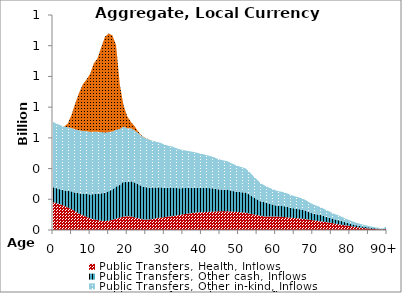
| Category | Public Transfers, Health, Inflows | Public Transfers, Other cash, Inflows | Public Transfers, Other in-kind, Inflows | Public Transfers, Education, Inflows |
|---|---|---|---|---|
| 0 | 181.392 | 97.981 | 424.615 | 0 |
|  | 174.145 | 97.458 | 420.827 | 0 |
| 2 | 167.344 | 97.129 | 417.9 | 0 |
| 3 | 158.039 | 100.06 | 415.681 | 0 |
| 4 | 146.757 | 107.985 | 414.015 | 24.991 |
| 5 | 136.594 | 115.028 | 412.747 | 86.294 |
| 6 | 120.806 | 122.581 | 411.723 | 170.289 |
| 7 | 107.274 | 131.753 | 410.788 | 242.456 |
| 8 | 96.344 | 138.584 | 409.787 | 303.097 |
| 9 | 86.519 | 149.341 | 408.567 | 335.093 |
| 10 | 76.235 | 154.927 | 407.285 | 378.06 |
| 11 | 69.835 | 163.818 | 406.102 | 444.971 |
| 12 | 64.805 | 171.273 | 403.294 | 477.943 |
| 13 | 60.067 | 178.689 | 398.081 | 553.456 |
| 14 | 58.728 | 184.061 | 391.249 | 624.63 |
| 15 | 60.785 | 192.512 | 384.344 | 641.855 |
| 16 | 66.425 | 197.652 | 377.031 | 626.849 |
| 17 | 73.264 | 209.281 | 370.054 | 551.113 |
| 18 | 80.301 | 213.286 | 363.929 | 289.528 |
| 19 | 88.064 | 227.235 | 358.278 | 139.84 |
| 20 | 89.388 | 221.265 | 352.228 | 77.954 |
| 21 | 88.582 | 228.749 | 345.98 | 40.091 |
| 22 | 82.518 | 226.507 | 339.471 | 27.086 |
| 23 | 76.21 | 221.739 | 332.59 | 9.22 |
| 24 | 70.201 | 213.411 | 325.45 | 3.098 |
| 25 | 67.569 | 211.699 | 318.326 | 1.483 |
| 26 | 68.55 | 206.788 | 311.221 | 1.103 |
| 27 | 72.314 | 204.07 | 303.988 | 0 |
| 28 | 77.538 | 199.615 | 296.599 | 0 |
| 29 | 81.316 | 196.775 | 289.155 | 0 |
| 30 | 83.654 | 191.311 | 281.769 | 0 |
| 31 | 87.14 | 187.899 | 274.403 | 0 |
| 32 | 90.428 | 186.685 | 267.401 | 0 |
| 33 | 93.36 | 180.823 | 260.939 | 0 |
| 34 | 97.533 | 173.812 | 254.876 | 0 |
| 35 | 102.347 | 170.554 | 248.866 | 0 |
| 36 | 105.52 | 167.621 | 242.947 | 0 |
| 37 | 108.761 | 166.14 | 237.227 | 0 |
| 38 | 112.403 | 163.538 | 231.717 | 0 |
| 39 | 114.824 | 160.843 | 226.366 | 0 |
| 40 | 115.73 | 158.997 | 221.078 | 0 |
| 41 | 116.856 | 157.668 | 215.828 | 0 |
| 42 | 118.083 | 154.681 | 210.657 | 0 |
| 43 | 119.154 | 152.975 | 205.561 | 0 |
| 44 | 121.104 | 145.485 | 200.482 | 0 |
| 45 | 122.558 | 141.258 | 195.302 | 0 |
| 46 | 122.999 | 139.806 | 189.972 | 0 |
| 47 | 121.93 | 141.494 | 184.584 | 0 |
| 48 | 119.929 | 136.256 | 179.148 | 0 |
| 49 | 118.789 | 132.629 | 173.556 | 0 |
| 50 | 116.738 | 130.799 | 167.956 | 0 |
| 51 | 114.514 | 131.086 | 162.638 | 0 |
| 52 | 111.924 | 131.916 | 155.931 | 0 |
| 53 | 107.294 | 122.202 | 147.122 | 0 |
| 54 | 102.24 | 110.901 | 137.129 | 0 |
| 55 | 97.264 | 102.153 | 127.433 | 0 |
| 56 | 92.319 | 93.74 | 117.554 | 0 |
| 57 | 88.642 | 92.538 | 109.527 | 0 |
| 58 | 87.763 | 85.574 | 104.456 | 0 |
| 59 | 88.022 | 79.368 | 101.349 | 0 |
| 60 | 87.623 | 72.346 | 98.064 | 0 |
| 61 | 86.668 | 69.789 | 94.971 | 0 |
| 62 | 84.86 | 71.03 | 91.81 | 0 |
| 63 | 82.838 | 68.134 | 88.219 | 0 |
| 64 | 80.51 | 64.36 | 84.359 | 0 |
| 65 | 78.406 | 62.1 | 80.799 | 0 |
| 66 | 76.564 | 60.039 | 77.478 | 0 |
| 67 | 74.191 | 59.316 | 73.784 | 0 |
| 68 | 71.05 | 55.615 | 69.486 | 0 |
| 69 | 67.239 | 48.811 | 64.812 | 0 |
| 70 | 63.773 | 44.027 | 60.241 | 0 |
| 71 | 60.297 | 42.158 | 55.708 | 0 |
| 72 | 56.913 | 42.049 | 51.259 | 0 |
| 73 | 53.525 | 37.106 | 46.975 | 0 |
| 74 | 49.927 | 33.213 | 42.842 | 0 |
| 75 | 46.074 | 29.89 | 38.774 | 0 |
| 76 | 41.634 | 27.092 | 34.797 | 0 |
| 77 | 37.307 | 26.406 | 31.035 | 0 |
| 78 | 33.345 | 22.942 | 27.546 | 0 |
| 79 | 29.693 | 18.78 | 24.305 | 0 |
| 80 | 25.971 | 15.462 | 21.223 | 0 |
| 81 | 22.078 | 13.307 | 18.31 | 0 |
| 82 | 18.414 | 11.438 | 15.667 | 0 |
| 83 | 15.147 | 10.116 | 13.333 | 0 |
| 84 | 12.38 | 8.608 | 11.269 | 0 |
| 85 | 9.91 | 7.37 | 9.386 | 0 |
| 86 | 7.557 | 6.223 | 7.685 | 0 |
| 87 | 5.675 | 4.858 | 6.206 | 0 |
| 88 | 4.387 | 3.938 | 4.952 | 0 |
| 89 | 3.344 | 2.9 | 3.898 | 0 |
| 90+ | 9.069 | 7.571 | 10.931 | 0 |